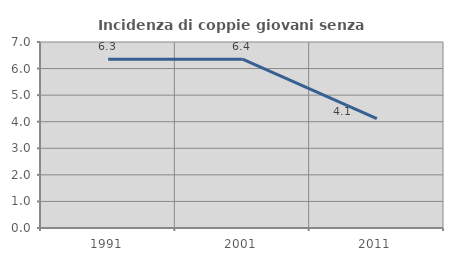
| Category | Incidenza di coppie giovani senza figli |
|---|---|
| 1991.0 | 6.347 |
| 2001.0 | 6.354 |
| 2011.0 | 4.119 |